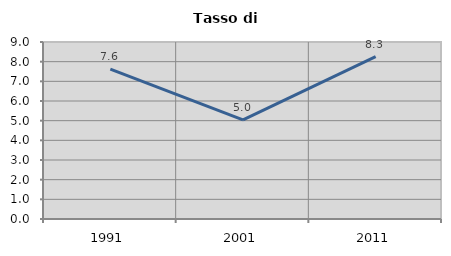
| Category | Tasso di disoccupazione   |
|---|---|
| 1991.0 | 7.618 |
| 2001.0 | 5.037 |
| 2011.0 | 8.26 |